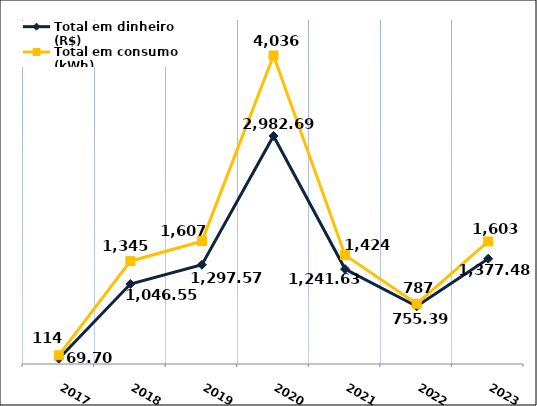
| Category | Total em dinheiro (R$) |
|---|---|
| 2017.0 | 69.7 |
| 2018.0 | 1046.55 |
| 2019.0 | 1297.57 |
| 2020.0 | 2982.69 |
| 2021.0 | 1241.63 |
| 2022.0 | 755.39 |
| 2023.0 | 1377.48 |